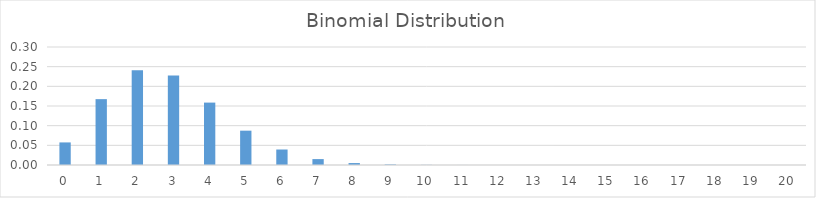
| Category | Series 0 |
|---|---|
| 0.0 | 0.057 |
| 1.0 | 0.167 |
| 2.0 | 0.241 |
| 3.0 | 0.227 |
| 4.0 | 0.159 |
| 5.0 | 0.087 |
| 6.0 | 0.039 |
| 7.0 | 0.015 |
| 8.0 | 0.005 |
| 9.0 | 0.001 |
| 10.0 | 0 |
| 11.0 | 0 |
| 12.0 | 0 |
| 13.0 | 0 |
| 14.0 | 0 |
| 15.0 | 0 |
| 16.0 | 0 |
| 17.0 | 0 |
| 18.0 | 0 |
| 19.0 | 0 |
| 20.0 | 0 |